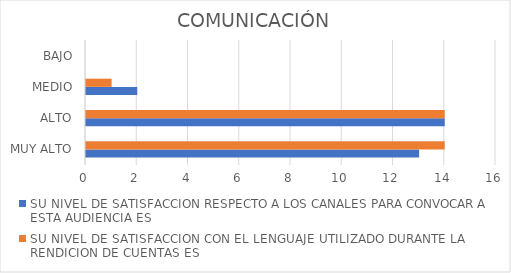
| Category | SU NIVEL DE SATISFACCION RESPECTO A LOS CANALES PARA CONVOCAR A ESTA AUDIENCIA ES | SU NIVEL DE SATISFACCION CON EL LENGUAJE UTILIZADO DURANTE LA RENDICION DE CUENTAS ES |
|---|---|---|
| MUY ALTO | 13 | 14 |
| ALTO | 14 | 14 |
| MEDIO | 2 | 1 |
| BAJO | 0 | 0 |